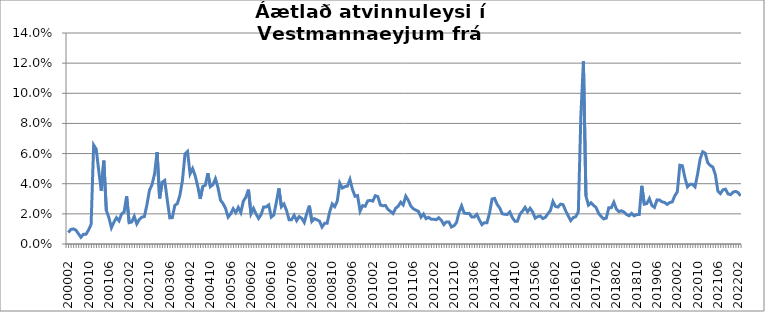
| Category | Series 0 |
|---|---|
| 200002 | 0.008 |
| 200003 | 0.01 |
| 200004 | 0.01 |
| 200005 | 0.009 |
| 200006 | 0.007 |
| 200007 | 0.004 |
| 200008 | 0.006 |
| 200009 | 0.006 |
| 200010 | 0.009 |
| 200011 | 0.013 |
| 200012 | 0.066 |
| 200101 | 0.063 |
| 200102 | 0.049 |
| 200103 | 0.035 |
| 200104 | 0.055 |
| 200105 | 0.022 |
| 200106 | 0.017 |
| 200107 | 0.011 |
| 200108 | 0.015 |
| 200109 | 0.017 |
| 200110 | 0.015 |
| 200111 | 0.02 |
| 200112 | 0.021 |
| 200201 | 0.032 |
| 200202 | 0.014 |
| 200203 | 0.015 |
| 200204 | 0.018 |
| 200205 | 0.013 |
| 200206 | 0.016 |
| 200207 | 0.018 |
| 200208 | 0.018 |
| 200209 | 0.026 |
| 200210 | 0.036 |
| 200211 | 0.039 |
| 200212 | 0.046 |
| 200301 | 0.061 |
| 200302 | 0.03 |
| 200303 | 0.041 |
| 200304 | 0.042 |
| 200305 | 0.029 |
| 200306 | 0.017 |
| 200307 | 0.017 |
| 200308 | 0.026 |
| 200309 | 0.027 |
| 200310 | 0.032 |
| 200311 | 0.042 |
| 200312 | 0.06 |
| 200401 | 0.061 |
| 200402 | 0.047 |
| 200403 | 0.05 |
| 200404 | 0.045 |
| 200405 | 0.038 |
| 200406 | 0.03 |
| 200407 | 0.038 |
| 200408 | 0.039 |
| 200409 | 0.047 |
| 200410 | 0.038 |
| 200411 | 0.039 |
| 200412 | 0.043 |
| 200501 | 0.037 |
| 200502 | 0.029 |
| 200503 | 0.027 |
| 200504 | 0.023 |
| 200505 | 0.018 |
| 200506 | 0.02 |
| 200507 | 0.023 |
| 200508 | 0.021 |
| 200509 | 0.024 |
| 200510 | 0.021 |
| 200511 | 0.028 |
| 200512 | 0.031 |
| 200601 | 0.036 |
| 200602 | 0.02 |
| 200603 | 0.024 |
| 200604 | 0.02 |
| 200605 | 0.017 |
| 200606 | 0.02 |
| 200607 | 0.025 |
| 200608 | 0.025 |
| 200609 | 0.026 |
| 200610 | 0.018 |
| 200611 | 0.019 |
| 200612 | 0.028 |
| 200701 | 0.037 |
| 200702 | 0.025 |
| 200703 | 0.027 |
| 200704 | 0.022 |
| 200705 | 0.016 |
| 200706 | 0.016 |
| 200707 | 0.019 |
| 200708 | 0.016 |
| 200709 | 0.018 |
| 200710 | 0.017 |
| 200711 | 0.014 |
| 200712 | 0.02 |
| 200801 | 0.025 |
| 200802 | 0.015 |
| 200803 | 0.017 |
| 200804 | 0.016 |
| 200805 | 0.015 |
| 200806 | 0.011 |
| 200807 | 0.014 |
| 200808 | 0.014 |
| 200809 | 0.021 |
| 200810 | 0.027 |
| 200811 | 0.025 |
| 200812 | 0.028 |
| 200901 | 0.04 |
| 200902 | 0.037 |
| 200903 | 0.038 |
| 200904 | 0.038 |
| 200905 | 0.043 |
| 200906 | 0.036 |
| 200907 | 0.032 |
| 200908 | 0.032 |
| 200909 | 0.022 |
| 200910 | 0.025 |
| 200911 | 0.025 |
| 200912 | 0.029 |
| 201001 | 0.029 |
| 201002 | 0.028 |
| 201003 | 0.032 |
| 201004 | 0.031 |
| 201005 | 0.026 |
| 201006 | 0.025 |
| 201007 | 0.026 |
| 201008 | 0.023 |
| 201009 | 0.022 |
| 201010 | 0.02 |
| 201011 | 0.024 |
| 201012 | 0.025 |
| 201101 | 0.028 |
| 201102 | 0.026 |
| 201103 | 0.032 |
| 201104 | 0.029 |
| 201105 | 0.025 |
| 201106 | 0.023 |
| 201107 | 0.022 |
| 201108 | 0.022 |
| 201109 | 0.018 |
| 201110 | 0.02 |
| 201111 | 0.017 |
| 201112 | 0.018 |
| 201201 | 0.017 |
| 201202 | 0.017 |
| 201203 | 0.016 |
| 201204 | 0.017 |
| 201205 | 0.016 |
| 201206 | 0.013 |
| 201207 | 0.015 |
| 201208 | 0.015 |
| 201209 | 0.011 |
| 201210 | 0.012 |
| 201211 | 0.014 |
| 201212 | 0.021 |
| 201301 | 0.025 |
| 201302 | 0.021 |
| 201303 | 0.02 |
| 201304 | 0.02 |
| 201305 | 0.018 |
| 201306 | 0.018 |
| 201307 | 0.02 |
| 201308 | 0.016 |
| 201309 | 0.013 |
| 201310 | 0.014 |
| 201311 | 0.014 |
| 201312 | 0.02 |
| 201401 | 0.03 |
| 201402 | 0.03 |
| 201403 | 0.026 |
| 201404 | 0.024 |
| 201405 | 0.02 |
| 201406 | 0.02 |
| 201407 | 0.02 |
| 201408 | 0.021 |
| 201409 | 0.017 |
| 201410 | 0.015 |
| 201411 | 0.015 |
| 201412 | 0.02 |
| 201501 | 0.022 |
| 201502 | 0.024 |
| 201503 | 0.021 |
| 201504 | 0.024 |
| 201505 | 0.021 |
| 201506 | 0.017 |
| 201507 | 0.018 |
| 201508 | 0.019 |
| 201509 | 0.017 |
| 201510 | 0.018 |
| 201511 | 0.02 |
| 201512 | 0.022 |
| 201601 | 0.028 |
| 201602 | 0.025 |
| 201603 | 0.025 |
| 201604 | 0.026 |
| 201605 | 0.026 |
| 201606 | 0.022 |
| 201607 | 0.019 |
| 201608 | 0.016 |
| 201609 | 0.018 |
| 201610 | 0.018 |
| 201611 | 0.021 |
| 201612 | 0.085 |
| 201701 | 0.121 |
| 201702 | 0.032 |
| 201703 | 0.026 |
| 201704 | 0.027 |
| 201705 | 0.026 |
| 201706 | 0.024 |
| 201707 | 0.02 |
| 201708 | 0.018 |
| 201709 | 0.017 |
| 201710 | 0.017 |
| 201711 | 0.024 |
| 201712 | 0.024 |
| 201801 | 0.028 |
| 201802 | 0.023 |
| 201803 | 0.022 |
| 201804 | 0.022 |
| 201805 | 0.021 |
| 201806 | 0.02 |
| 201807 | 0.019 |
| 201808 | 0.02 |
| 201809 | 0.019 |
| 201810 | 0.02 |
| 201811 | 0.02 |
| 201812 | 0.039 |
| 201901 | 0.026 |
| 201902 | 0.027 |
| 201903 | 0.03 |
| 201904 | 0.026 |
| 201905 | 0.024 |
| 201906 | 0.029 |
| 201907 | 0.029 |
| 201908 | 0.028 |
| 201909 | 0.028 |
| 201910 | 0.026 |
| 201911 | 0.027 |
| 201912 | 0.028 |
| 202001 | 0.032 |
| 202002 | 0.035 |
| 202003 | 0.052 |
| 202004 | 0.052 |
| 202005 | 0.044 |
| 202006 | 0.038 |
| 202007 | 0.04 |
| 202008 | 0.04 |
| 202009 | 0.038 |
| 202010 | 0.046 |
| 202011 | 0.056 |
| 202012 | 0.061 |
| 202101 | 0.06 |
| 202102 | 0.054 |
| 202103 | 0.052 |
| 202104 | 0.051 |
| 202105 | 0.046 |
| 202106 | 0.035 |
| 202107 | 0.033 |
| 202108 | 0.036 |
| 202109 | 0.036 |
| 202110 | 0.033 |
| 202111 | 0.033 |
| 202112 | 0.034 |
| 202201 | 0.035 |
| 202202 | 0.034 |
| 202203 | 0.032 |